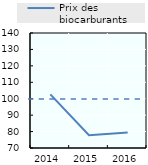
| Category | Prix des biocarburants |
|---|---|
| 2014.0 | 102.646 |
| 2015.0 | 77.756 |
| 2016.0 | 79.479 |